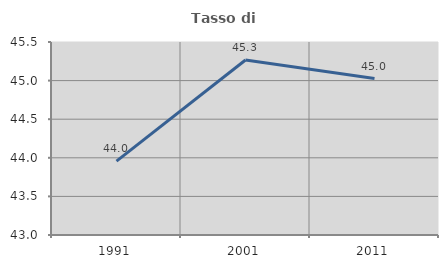
| Category | Tasso di occupazione   |
|---|---|
| 1991.0 | 43.957 |
| 2001.0 | 45.267 |
| 2011.0 | 45.027 |